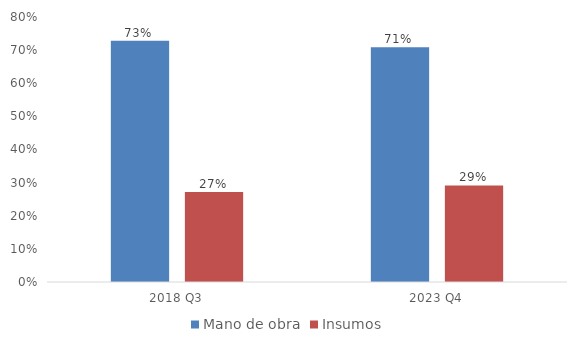
| Category | Mano de obra | Insumos |
|---|---|---|
| 2018 Q3 | 0.728 | 0.272 |
| 2023 Q4 | 0.709 | 0.291 |